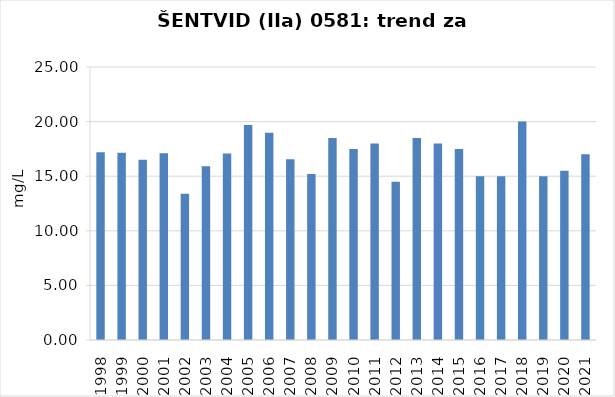
| Category | Vsota |
|---|---|
| 1998 | 17.2 |
| 1999 | 17.15 |
| 2000 | 16.5 |
| 2001 | 17.1 |
| 2002 | 13.4 |
| 2003 | 15.9 |
| 2004 | 17.075 |
| 2005 | 19.7 |
| 2006 | 18.975 |
| 2007 | 16.55 |
| 2008 | 15.2 |
| 2009 | 18.5 |
| 2010 | 17.5 |
| 2011 | 18 |
| 2012 | 14.5 |
| 2013 | 18.5 |
| 2014 | 18 |
| 2015 | 17.5 |
| 2016 | 15 |
| 2017 | 15 |
| 2018 | 20 |
| 2019 | 15 |
| 2020 | 15.5 |
| 2021 | 17 |